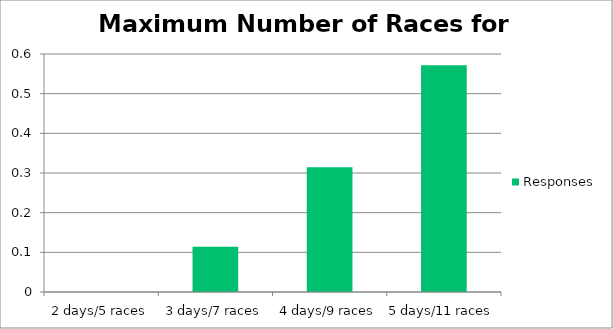
| Category | Responses |
|---|---|
| _x000e_2 days/5 races | 0 |
| _x000e_3 days/7 races | 0.114 |
| _x000e_4 days/9 races | 0.314 |
| _x000f_5 days/11 races | 0.571 |